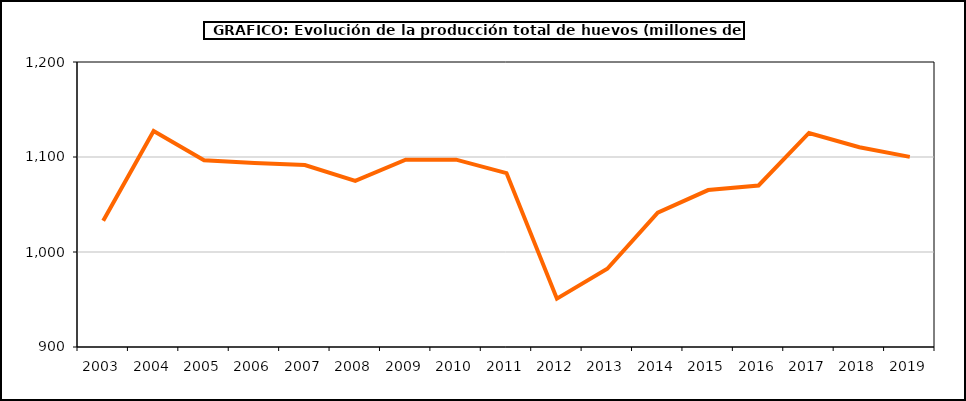
| Category | huevos |
|---|---|
| 2003.0 | 1033 |
| 2004.0 | 1127.271 |
| 2005.0 | 1096.54 |
| 2006.0 | 1093.721 |
| 2007.0 | 1091.465 |
| 2008.0 | 1074.834 |
| 2009.0 | 1097.178 |
| 2010.0 | 1097.2 |
| 2011.0 | 1083.082 |
| 2012.0 | 950.879 |
| 2013.0 | 982.375 |
| 2014.0 | 1041.522 |
| 2015.0 | 1065.202 |
| 2016.0 | 1070 |
| 2017.0 | 1125.287 |
| 2018.0 | 1110.274 |
| 2019.0 | 1100.164 |